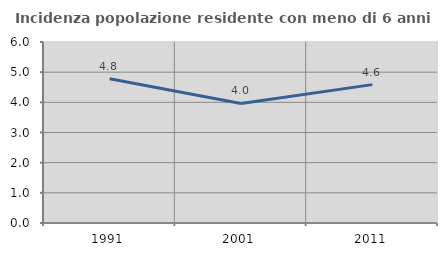
| Category | Incidenza popolazione residente con meno di 6 anni |
|---|---|
| 1991.0 | 4.781 |
| 2001.0 | 3.964 |
| 2011.0 | 4.587 |